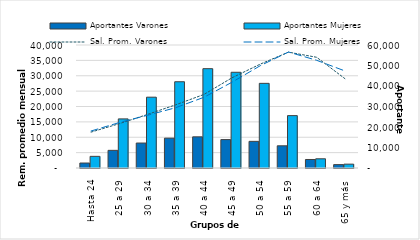
| Category | Aportantes Varones | Aportantes Mujeres |
|---|---|---|
| 0 | 2431 | 5683 |
| 1 | 8610 | 23950 |
| 2 | 12175 | 34548 |
| 3 | 14560 | 42079 |
| 4 | 15201 | 48453 |
| 5 | 13862 | 46694 |
| 6 | 12997 | 41289 |
| 7 | 10829 | 25553 |
| 8 | 4151 | 4491 |
| 9 | 1650 | 1879 |